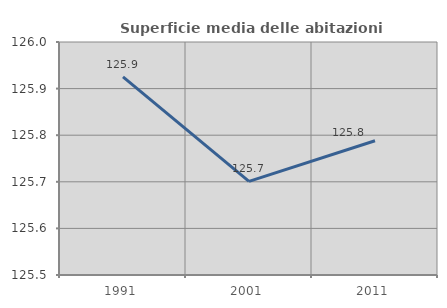
| Category | Superficie media delle abitazioni occupate |
|---|---|
| 1991.0 | 125.925 |
| 2001.0 | 125.701 |
| 2011.0 | 125.788 |